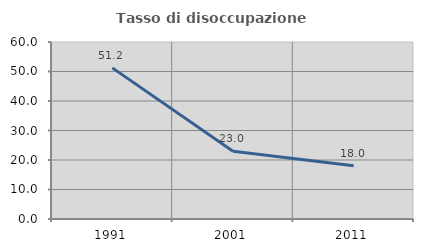
| Category | Tasso di disoccupazione giovanile  |
|---|---|
| 1991.0 | 51.227 |
| 2001.0 | 22.981 |
| 2011.0 | 18.033 |